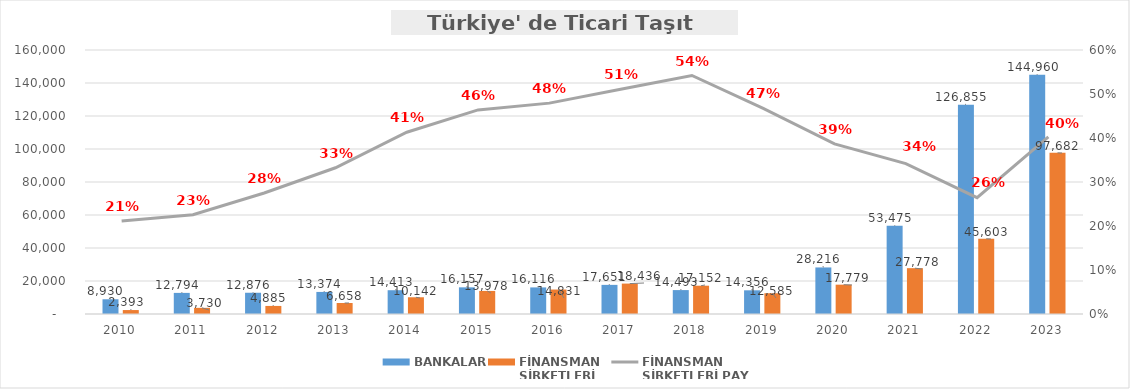
| Category | BANKALAR | FİNANSMAN 
ŞİRKETLERİ |
|---|---|---|
| 2010 | 8930.131 | 2392.721 |
| 2011 | 12793.723 | 3729.987 |
| 2012 | 12876.346 | 4885.495 |
| 2013 | 13374.424 | 6657.806 |
| 2014 | 14412.767 | 10141.887 |
| 2015 | 16157.225 | 13978.426 |
| 2016 | 16116.463 | 14831.249 |
| 2017 | 17650.963 | 18436.034 |
| 2018 | 14492.83 | 17152.034 |
| 2019 | 14355.978 | 12584.792 |
| 2020 | 28216.157 | 17779.072 |
| 2021 | 53475.488 | 27778.353 |
| 2022 | 126855.404 | 45602.871 |
| 2023 | 144959.787 | 97681.588 |